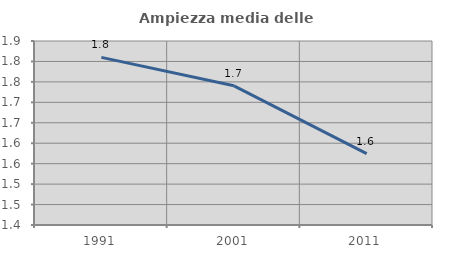
| Category | Ampiezza media delle famiglie |
|---|---|
| 1991.0 | 1.81 |
| 2001.0 | 1.74 |
| 2011.0 | 1.574 |